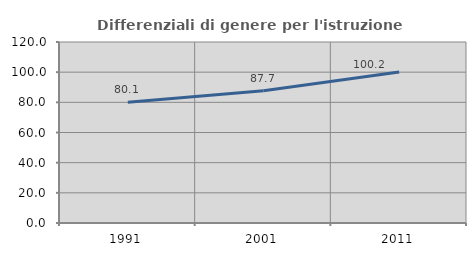
| Category | Differenziali di genere per l'istruzione superiore |
|---|---|
| 1991.0 | 80.093 |
| 2001.0 | 87.681 |
| 2011.0 | 100.175 |